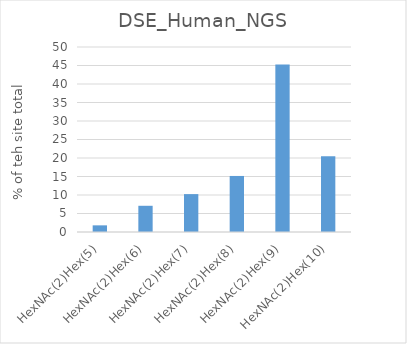
| Category | Series 0 |
|---|---|
| HexNAc(2)Hex(5) | 1.797 |
| HexNAc(2)Hex(6) | 7.085 |
| HexNAc(2)Hex(7) | 10.241 |
| HexNAc(2)Hex(8) | 15.147 |
| HexNAc(2)Hex(9) | 45.279 |
| HexNAc(2)Hex(10) | 20.452 |